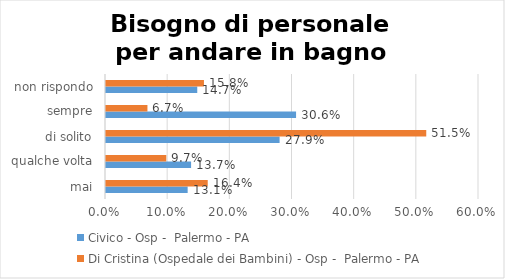
| Category | Civico - Osp -  Palermo - PA | Di Cristina (Ospedale dei Bambini) - Osp -  Palermo - PA |
|---|---|---|
| mai | 0.131 | 0.164 |
| qualche volta | 0.137 | 0.097 |
| di solito | 0.279 | 0.515 |
| sempre | 0.306 | 0.067 |
| non rispondo | 0.147 | 0.158 |